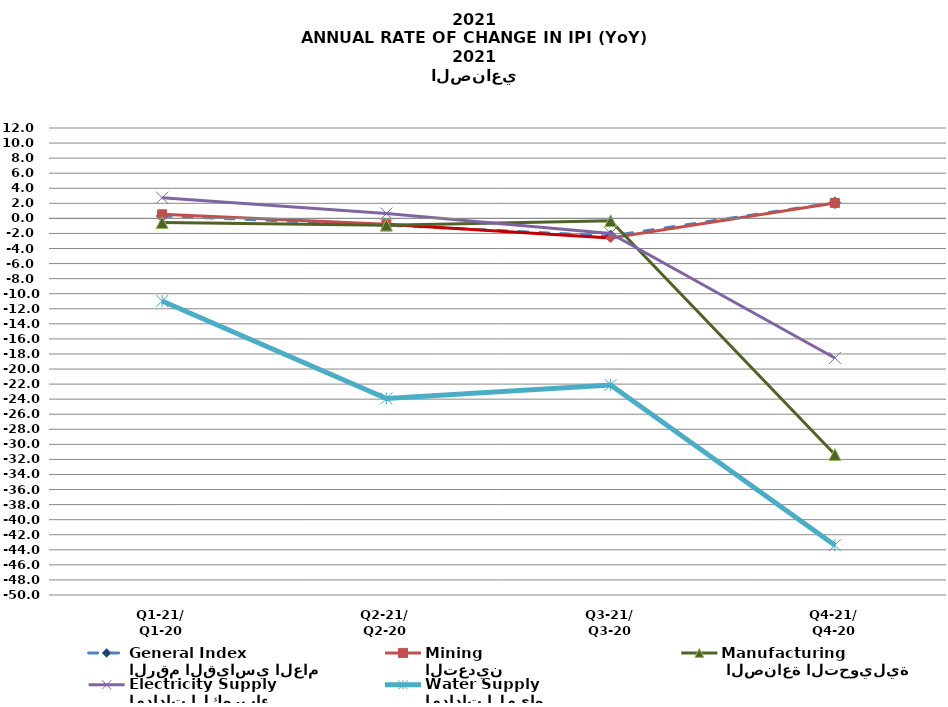
| Category | الرقم القياسي العام 
General Index | التعدين
Mining |  الصناعة التحويلية
Manufacturing | إمدادات الكهرباء 
Electricity Supply | إمدادات المياه 
Water Supply |
|---|---|---|---|---|---|
| Q1-21/
Q1-20 | 0.325 | 0.543 | -0.554 | 2.744 | -10.972 |
| Q2-21/
Q2-20 | -0.888 | -0.771 | -0.895 | 0.644 | -23.904 |
| Q3-21/
Q3-20 | -2.339 | -2.617 | -0.302 | -1.999 | -22.118 |
| Q4-21/
Q4-20 | 2.084 | 2.052 | -31.345 | -18.534 | -43.388 |